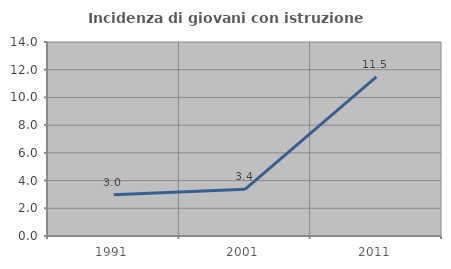
| Category | Incidenza di giovani con istruzione universitaria |
|---|---|
| 1991.0 | 2.97 |
| 2001.0 | 3.371 |
| 2011.0 | 11.475 |